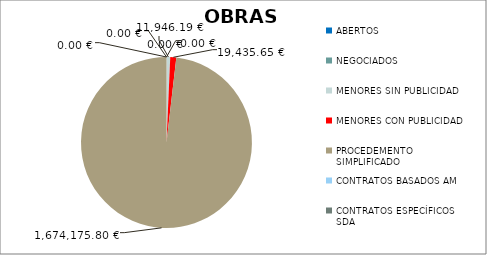
| Category | Series 0 |
|---|---|
| ABERTOS  | 0 |
| NEGOCIADOS  | 0 |
| MENORES SIN PUBLICIDAD | 11946.19 |
| MENORES CON PUBLICIDAD | 19435.65 |
| PROCEDEMENTO SIMPLIFICADO | 1674175.8 |
| CONTRATOS BASADOS AM | 0 |
| CONTRATOS ESPECÍFICOS SDA | 0 |